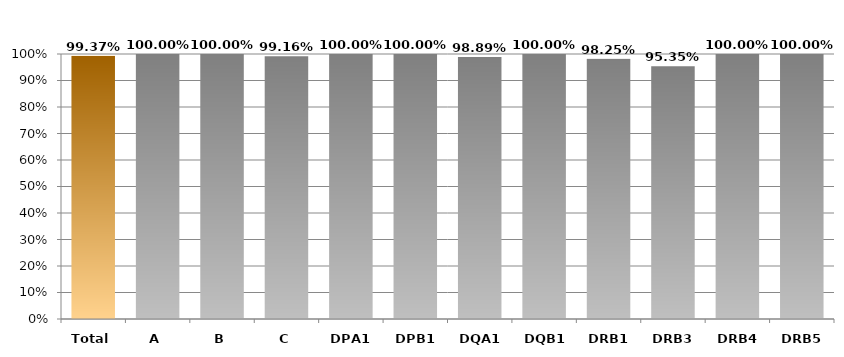
| Category | Series 0 |
|---|---|
| Total | 0.994 |
| A | 1 |
| B | 1 |
| C | 0.992 |
| DPA1 | 1 |
| DPB1 | 1 |
| DQA1 | 0.989 |
| DQB1 | 1 |
| DRB1 | 0.982 |
| DRB3 | 0.953 |
| DRB4 | 1 |
| DRB5 | 1 |